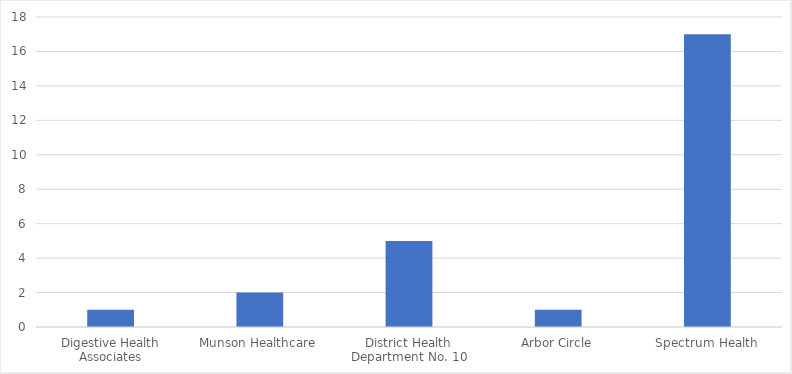
| Category | Number of Responses |
|---|---|
| Digestive Health Associates | 1 |
| Munson Healthcare | 2 |
| District Health Department No. 10 | 5 |
| Arbor Circle | 1 |
| Spectrum Health | 17 |